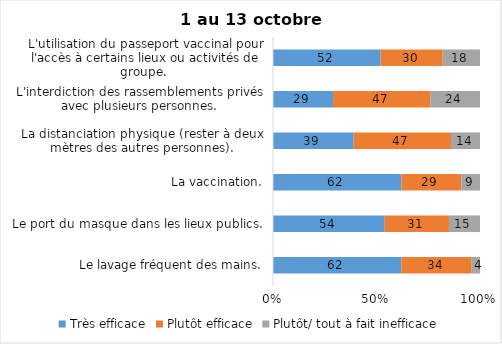
| Category | Très efficace | Plutôt efficace | Plutôt/ tout à fait inefficace |
|---|---|---|---|
| Le lavage fréquent des mains. | 62 | 34 | 4 |
| Le port du masque dans les lieux publics. | 54 | 31 | 15 |
| La vaccination. | 62 | 29 | 9 |
| La distanciation physique (rester à deux mètres des autres personnes). | 39 | 47 | 14 |
| L'interdiction des rassemblements privés avec plusieurs personnes. | 29 | 47 | 24 |
| L'utilisation du passeport vaccinal pour l'accès à certains lieux ou activités de groupe.  | 52 | 30 | 18 |